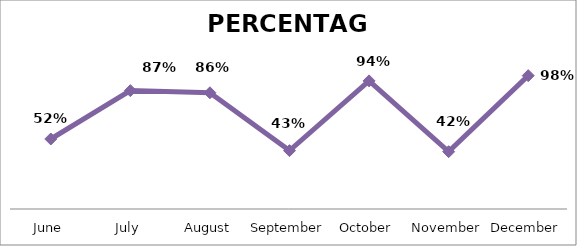
| Category | PERCENTAGE |
|---|---|
| June | 0.515 |
| July | 0.872 |
| August | 0.855 |
| September | 0.43 |
| October | 0.943 |
| November | 0.422 |
| December | 0.982 |